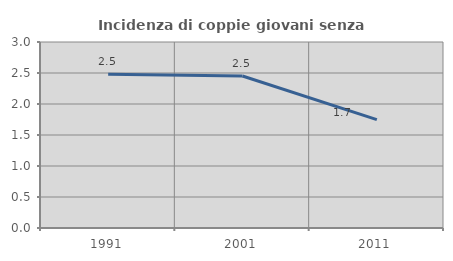
| Category | Incidenza di coppie giovani senza figli |
|---|---|
| 1991.0 | 2.481 |
| 2001.0 | 2.452 |
| 2011.0 | 1.748 |